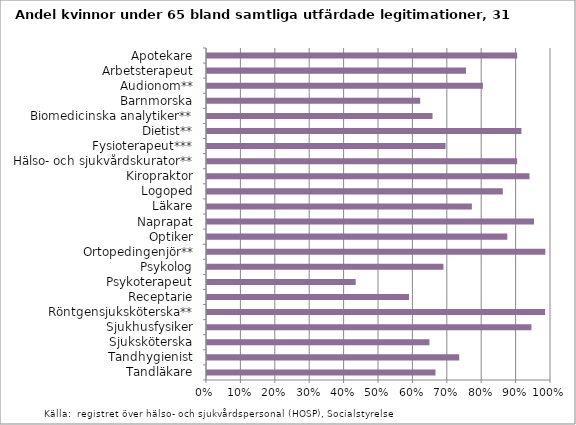
| Category | Kvinnor |
|---|---|
| Apotekare | 0.902 |
| Arbetsterapeut | 0.753 |
| Audionom** | 0.802 |
| Barnmorska | 0.62 |
| Biomedicinska analytiker** | 0.656 |
| Dietist** | 0.914 |
| Fysioterapeut*** | 0.693 |
| Hälso- och sjukvårdskurator** | 0.902 |
| Kiropraktor | 0.938 |
| Logoped | 0.86 |
| Läkare | 0.77 |
| Naprapat | 0.951 |
| Optiker | 0.873 |
| Ortopedingenjör** | 0.984 |
| Psykolog | 0.687 |
| Psykoterapeut | 0.432 |
| Receptarie | 0.587 |
| Röntgensjuksköterska** | 0.983 |
| Sjukhusfysiker | 0.943 |
| Sjuksköterska | 0.647 |
| Tandhygienist | 0.733 |
| Tandläkare | 0.664 |